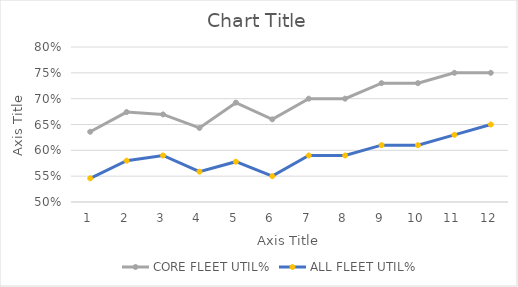
| Category | CORE FLEET UTIL% | ALL FLEET UTIL% |
|---|---|---|
| 0 | 0.636 | 0.546 |
| 1 | 0.674 | 0.58 |
| 2 | 0.669 | 0.59 |
| 3 | 0.643 | 0.559 |
| 4 | 0.692 | 0.578 |
| 5 | 0.66 | 0.55 |
| 6 | 0.7 | 0.59 |
| 7 | 0.7 | 0.59 |
| 8 | 0.73 | 0.61 |
| 9 | 0.73 | 0.61 |
| 10 | 0.75 | 0.63 |
| 11 | 0.75 | 0.65 |